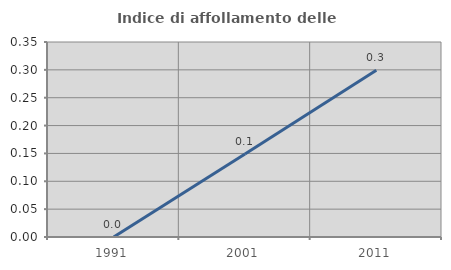
| Category | Indice di affollamento delle abitazioni  |
|---|---|
| 1991.0 | 0 |
| 2001.0 | 0.149 |
| 2011.0 | 0.299 |